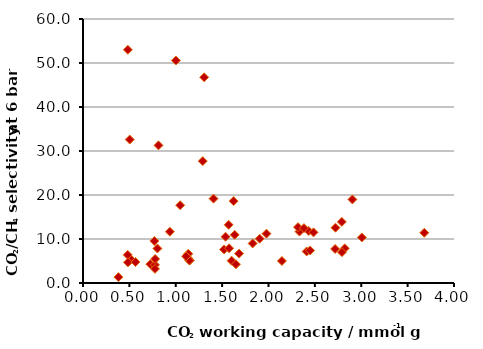
| Category | Series 0 |
|---|---|
| 1.602284636400601 | 5.07 |
| 2.7223757922801815 | 12.562 |
| 0.5176767876803917 | 5.365 |
| 1.0011978049952965 | 50.57 |
| 1.1349677253606072 | 6.641 |
| 1.1506323594906518 | 5.132 |
| 1.2909794528627534 | 27.704 |
| 0.48178610594495797 | 6.391 |
| 2.4120592138549677 | 7.165 |
| 2.8216334545095014 | 7.879 |
| 2.433475104152202 | 11.827 |
| 1.9048943835986387 | 10.073 |
| 2.334027087590626 | 11.694 |
| 3.6794811118327324 | 11.42 |
| 1.3066276735982416 | 46.749 |
| 0.5039220062551455 | 32.609 |
| 0.48460839555495794 | 4.689 |
| 1.5367119989787965 | 10.515 |
| 0.8137574906186176 | 31.284 |
| 0.38186733710034293 | 1.336 |
| 1.9777780198802015 | 11.211 |
| 1.5702786022439146 | 13.222 |
| 3.006267648095224 | 10.358 |
| 2.4857285948135823 | 11.5 |
| 0.7262912072859952 | 4.276 |
| 1.5209413533171448 | 7.615 |
| 1.134134375626787 | 5.608 |
| 1.6488283663092456 | 4.261 |
| 0.48341761133470484 | 53.005 |
| 2.318111936784506 | 12.691 |
| 1.147623842125634 | 5.11 |
| 0.7695209587894642 | 9.546 |
| 0.7758282860835313 | 4.117 |
| 2.904781265512127 | 18.993 |
| 1.8292953451895493 | 8.995 |
| 2.718297835163081 | 7.736 |
| 1.6240599599746124 | 18.613 |
| 0.5656581484588463 | 4.762 |
| 1.4072961392160779 | 19.179 |
| 1.6352983474049507 | 10.953 |
| 0.9366575905158054 | 11.661 |
| 2.79170653693335 | 7.006 |
| 0.7777521520172049 | 5.465 |
| 2.1449090839016103 | 5.008 |
| 1.6825100698988744 | 6.681 |
| 1.1122801970318035 | 6.079 |
| 2.7908931456807857 | 13.892 |
| 2.448835063174675 | 7.392 |
| 2.3822452202603595 | 12.478 |
| 1.0477464330307984 | 17.678 |
| 1.5751948423384763 | 7.888 |
| 0.7757045527629778 | 3.213 |
| 0.8022876154901777 | 7.846 |